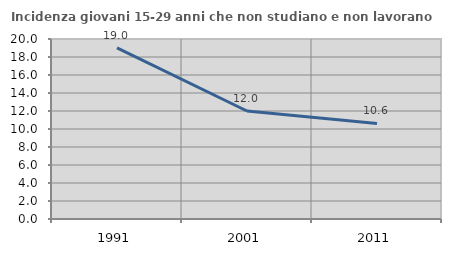
| Category | Incidenza giovani 15-29 anni che non studiano e non lavorano  |
|---|---|
| 1991.0 | 19.008 |
| 2001.0 | 12 |
| 2011.0 | 10.615 |